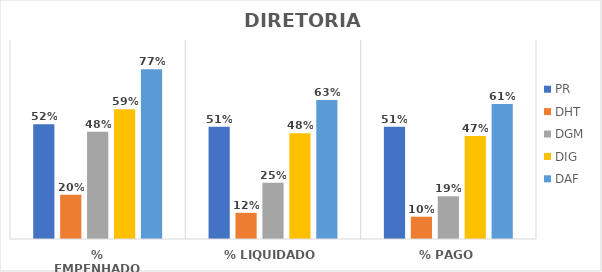
| Category | PR | DHT | DGM | DIG | DAF |
|---|---|---|---|---|---|
| % EMPENHADO | 0.519 | 0.201 | 0.485 | 0.587 | 0.767 |
| % LIQUIDADO | 0.507 | 0.118 | 0.255 | 0.478 | 0.628 |
| % PAGO | 0.507 | 0.101 | 0.193 | 0.466 | 0.611 |